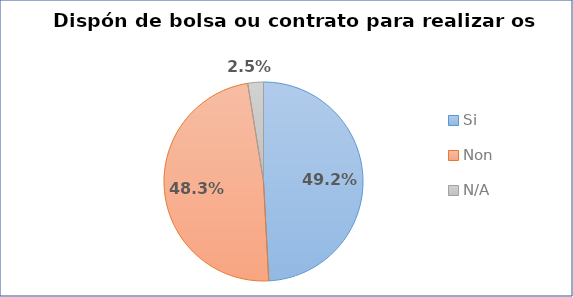
| Category | Dispón de bolsa ou contrato para realizar os estudos? |
|---|---|
| Si | 0.492 |
| Non | 0.483 |
| N/A | 0.025 |